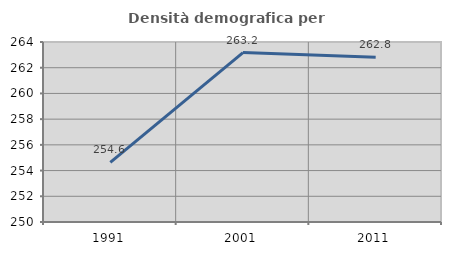
| Category | Densità demografica |
|---|---|
| 1991.0 | 254.638 |
| 2001.0 | 263.179 |
| 2011.0 | 262.808 |